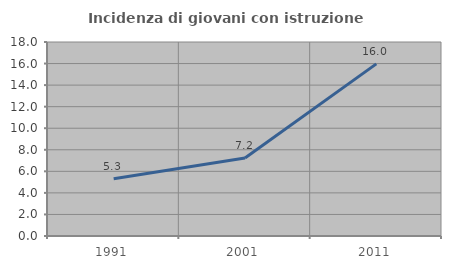
| Category | Incidenza di giovani con istruzione universitaria |
|---|---|
| 1991.0 | 5.319 |
| 2001.0 | 7.229 |
| 2011.0 | 15.972 |